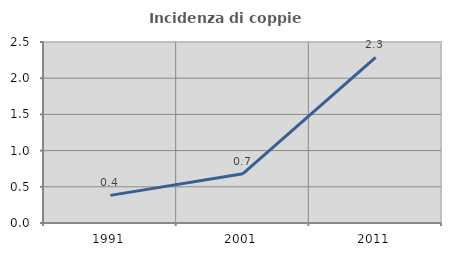
| Category | Incidenza di coppie miste |
|---|---|
| 1991.0 | 0.382 |
| 2001.0 | 0.681 |
| 2011.0 | 2.288 |